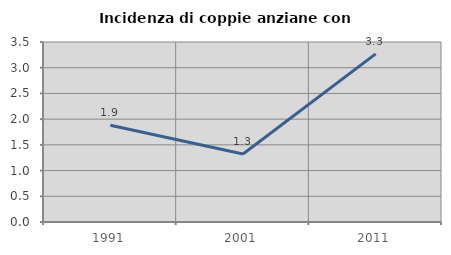
| Category | Incidenza di coppie anziane con figli |
|---|---|
| 1991.0 | 1.882 |
| 2001.0 | 1.323 |
| 2011.0 | 3.27 |